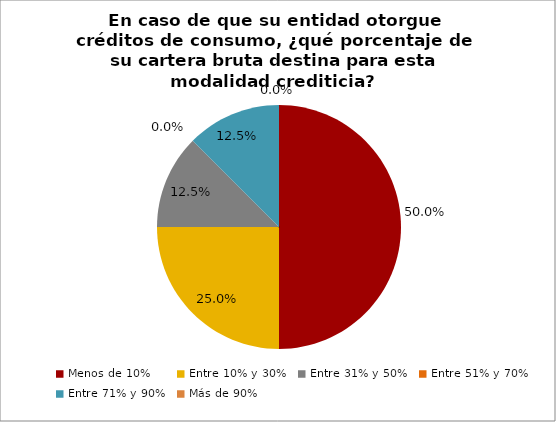
| Category | Series 0 |
|---|---|
| Menos de 10% | 0.5 |
| Entre 10% y 30% | 0.25 |
| Entre 31% y 50% | 0.125 |
| Entre 51% y 70% | 0 |
| Entre 71% y 90% | 0.125 |
| Más de 90% | 0 |